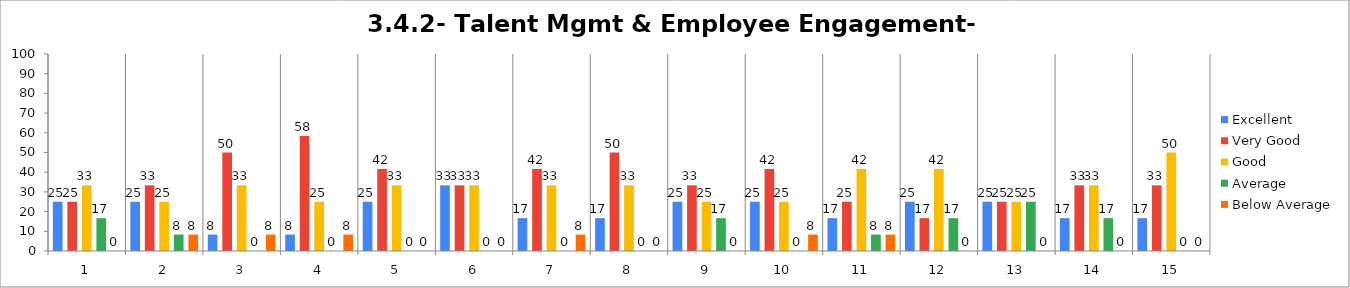
| Category | Excellent | Very Good | Good | Average | Below Average |
|---|---|---|---|---|---|
| 0 | 25 | 25 | 33.333 | 16.667 | 0 |
| 1 | 25 | 33.333 | 25 | 8.333 | 8.333 |
| 2 | 8.333 | 50 | 33.333 | 0 | 8.333 |
| 3 | 8.333 | 58.333 | 25 | 0 | 8.333 |
| 4 | 25 | 41.667 | 33.333 | 0 | 0 |
| 5 | 33.333 | 33.333 | 33.333 | 0 | 0 |
| 6 | 16.667 | 41.667 | 33.333 | 0 | 8.333 |
| 7 | 16.667 | 50 | 33.333 | 0 | 0 |
| 8 | 25 | 33.333 | 25 | 16.667 | 0 |
| 9 | 25 | 41.667 | 25 | 0 | 8.333 |
| 10 | 16.667 | 25 | 41.667 | 8.333 | 8.333 |
| 11 | 25 | 16.667 | 41.667 | 16.667 | 0 |
| 12 | 25 | 25 | 25 | 25 | 0 |
| 13 | 16.667 | 33.333 | 33.333 | 16.667 | 0 |
| 14 | 16.667 | 33.333 | 50 | 0 | 0 |